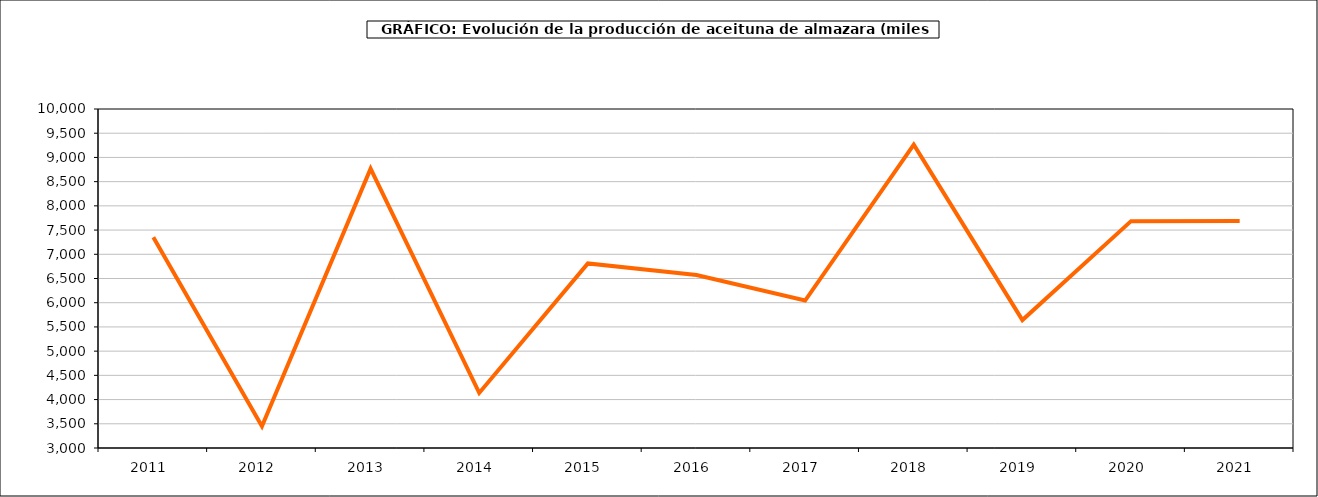
| Category | producción |
|---|---|
| 2011.0 | 7352.697 |
| 2012.0 | 3448.612 |
| 2013.0 | 8766.897 |
| 2014.0 | 4136.73 |
| 2015.0 | 6811.611 |
| 2016.0 | 6571.428 |
| 2017.0 | 6044.453 |
| 2018.0 | 9264.536 |
| 2019.0 | 5642.056 |
| 2020.0 | 7684.413 |
| 2021.0 | 7687.565 |